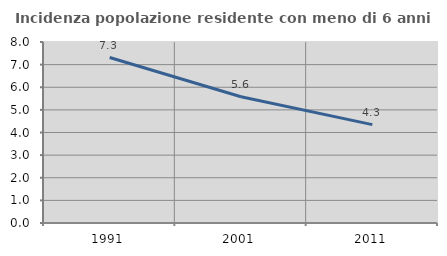
| Category | Incidenza popolazione residente con meno di 6 anni |
|---|---|
| 1991.0 | 7.313 |
| 2001.0 | 5.58 |
| 2011.0 | 4.347 |